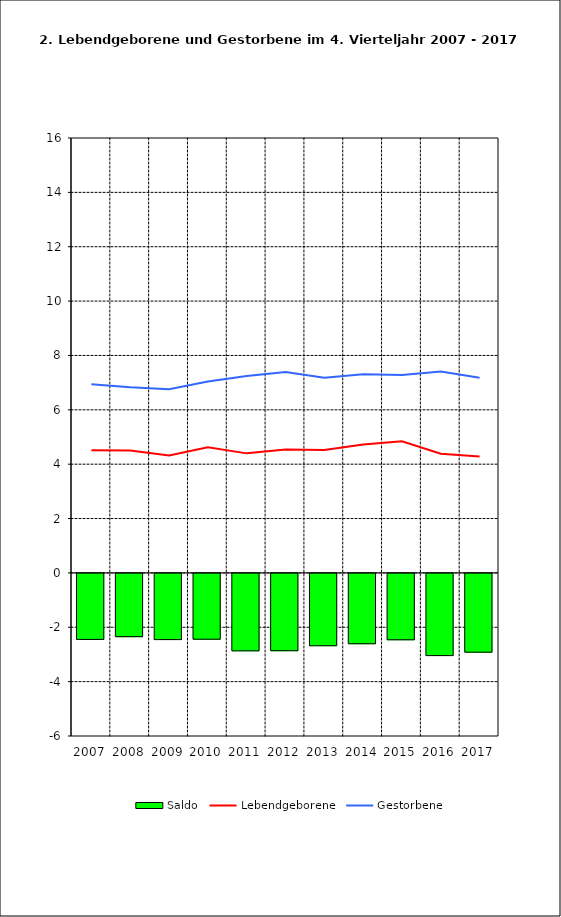
| Category | Saldo |
|---|---|
| 2005.0 | -2.429 |
| 2006.0 | -2.326 |
| 2007.0 | -2.435 |
| 2008.0 | -2.421 |
| 2009.0 | -2.849 |
| 2010.0 | -2.844 |
| 2011.0 | -2.66 |
| 2012.0 | -2.587 |
| 2013.0 | -2.442 |
| 2014.0 | -3.024 |
| 2015.0 | -2.898 |